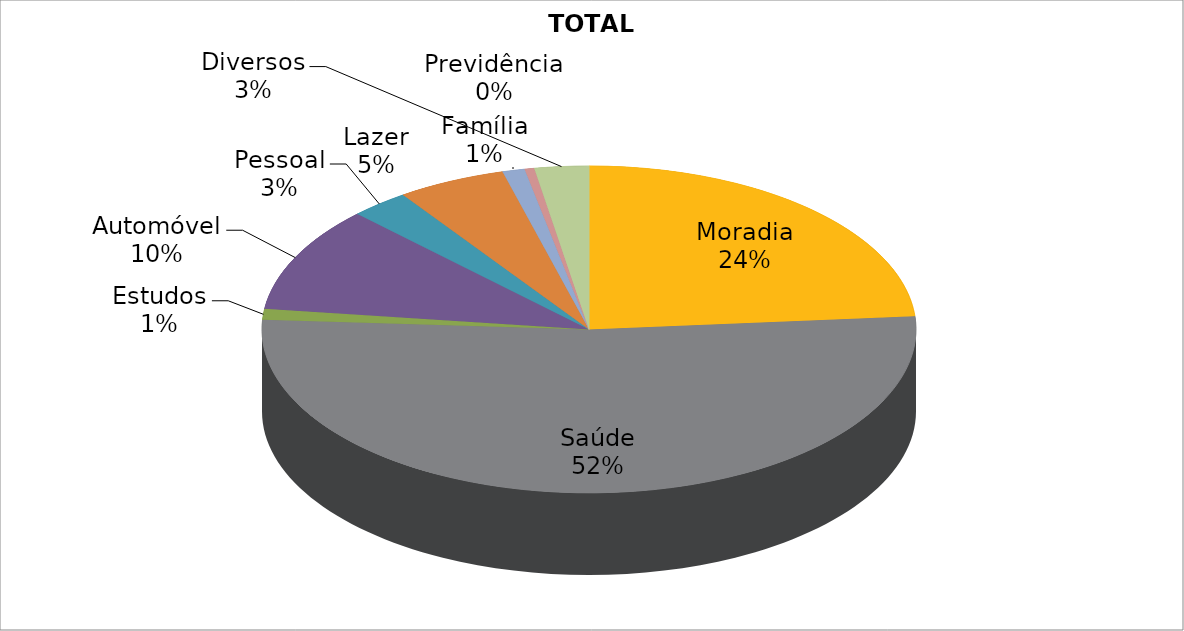
| Category | TOTAL |
|---|---|
| Moradia | 15027 |
| Saúde | 33100 |
| Estudos | 680 |
| Automóvel | 6630 |
| Pessoal | 1840 |
| Lazer | 3400 |
| Família | 700 |
| Previdência | 300 |
| Diversos | 1700 |